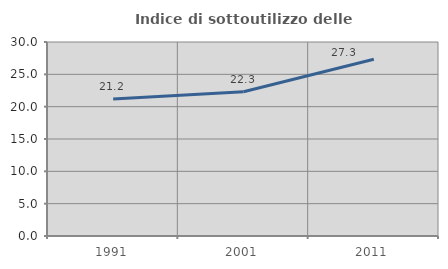
| Category | Indice di sottoutilizzo delle abitazioni  |
|---|---|
| 1991.0 | 21.182 |
| 2001.0 | 22.308 |
| 2011.0 | 27.337 |